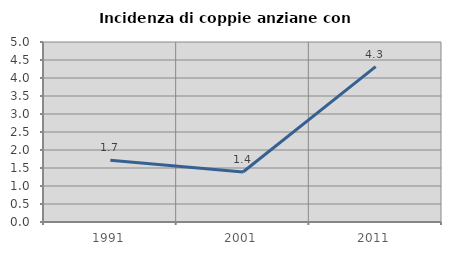
| Category | Incidenza di coppie anziane con figli |
|---|---|
| 1991.0 | 1.717 |
| 2001.0 | 1.389 |
| 2011.0 | 4.317 |